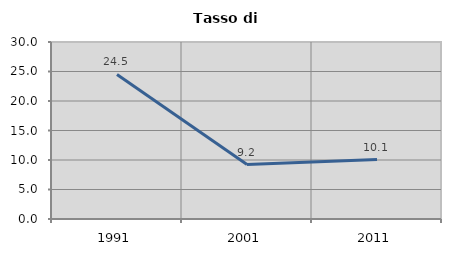
| Category | Tasso di disoccupazione   |
|---|---|
| 1991.0 | 24.503 |
| 2001.0 | 9.231 |
| 2011.0 | 10.072 |